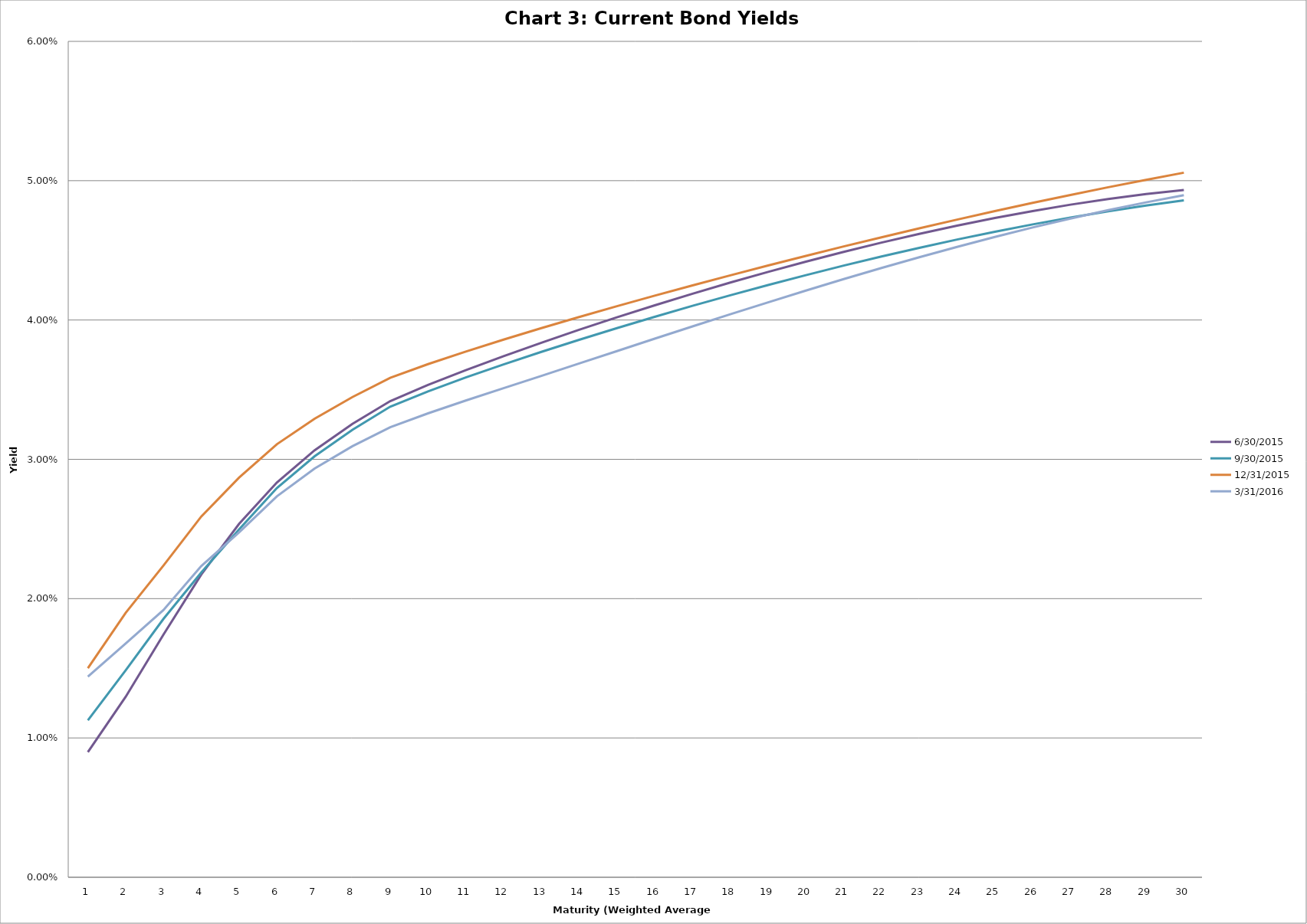
| Category | 6/30/2015 | 9/30/2015 | 12/31/2015 | 3/31/2016 |
|---|---|---|---|---|
| 0 | 0.009 | 0.011 | 0.015 | 0.014 |
| 1 | 0.013 | 0.015 | 0.019 | 0.017 |
| 2 | 0.017 | 0.019 | 0.022 | 0.019 |
| 3 | 0.022 | 0.022 | 0.026 | 0.022 |
| 4 | 0.025 | 0.025 | 0.029 | 0.025 |
| 5 | 0.028 | 0.028 | 0.031 | 0.027 |
| 6 | 0.031 | 0.03 | 0.033 | 0.029 |
| 7 | 0.033 | 0.032 | 0.034 | 0.031 |
| 8 | 0.034 | 0.034 | 0.036 | 0.032 |
| 9 | 0.035 | 0.035 | 0.037 | 0.033 |
| 10 | 0.036 | 0.036 | 0.038 | 0.034 |
| 11 | 0.037 | 0.037 | 0.039 | 0.035 |
| 12 | 0.038 | 0.038 | 0.039 | 0.036 |
| 13 | 0.039 | 0.039 | 0.04 | 0.037 |
| 14 | 0.04 | 0.039 | 0.041 | 0.038 |
| 15 | 0.041 | 0.04 | 0.042 | 0.039 |
| 16 | 0.042 | 0.041 | 0.042 | 0.04 |
| 17 | 0.043 | 0.042 | 0.043 | 0.04 |
| 18 | 0.043 | 0.043 | 0.044 | 0.041 |
| 19 | 0.044 | 0.043 | 0.045 | 0.042 |
| 20 | 0.045 | 0.044 | 0.045 | 0.043 |
| 21 | 0.046 | 0.045 | 0.046 | 0.044 |
| 22 | 0.046 | 0.045 | 0.047 | 0.045 |
| 23 | 0.047 | 0.046 | 0.047 | 0.045 |
| 24 | 0.047 | 0.046 | 0.048 | 0.046 |
| 25 | 0.048 | 0.047 | 0.048 | 0.047 |
| 26 | 0.048 | 0.047 | 0.049 | 0.047 |
| 27 | 0.049 | 0.048 | 0.05 | 0.048 |
| 28 | 0.049 | 0.048 | 0.05 | 0.048 |
| 29 | 0.049 | 0.049 | 0.051 | 0.049 |